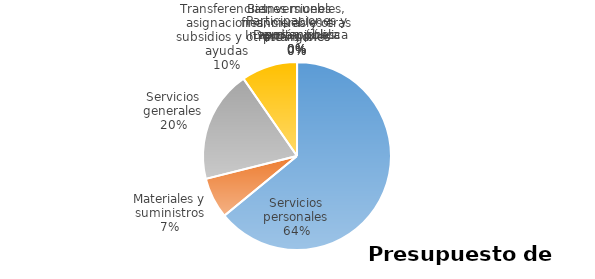
| Category | Series 0 | Series 1 | Series 2 | Series 3 | Series 4 | Series 5 |
|---|---|---|---|---|---|---|
| Servicios personales | 33952430 |  |  |  |  |  |
| Materiales y suministros | 3730578 |  |  |  |  |  |
| Servicios generales | 10217836 |  |  |  |  |  |
| Transferencias, asignaciones, subsidios y otras ayudas | 5107441 |  |  |  |  |  |
| Bienes muebles, inmuebles e intangibles | 0 |  |  |  |  |  |
| Inversión pública | 0 |  |  |  |  |  |
| Inversiones financieras y otras provisiones | 0 |  |  |  |  |  |
| Participaciones y aportaciones | 0 |  |  |  |  |  |
| Deuda pública | 0 |  |  |  |  |  |